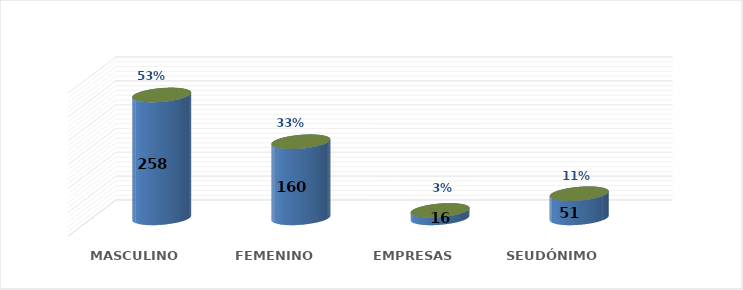
| Category | SOLICITUD POR GÉNERO | Series 1 |
|---|---|---|
| MASCULINO | 258 | 0.532 |
| FEMENINO | 160 | 0.33 |
| EMPRESAS | 16 | 0.033 |
| SEUDÓNIMO | 51 | 0.105 |